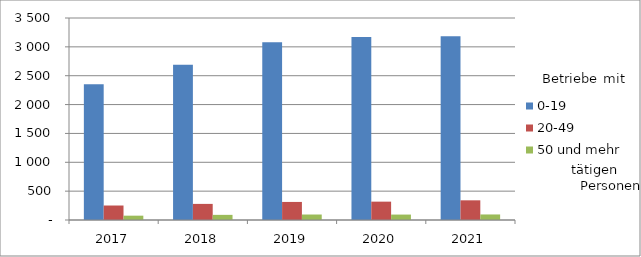
| Category | 0-19 | 20-49 | 50 und mehr |
|---|---|---|---|
| 2017.0 | 2350 | 251 | 75 |
| 2018.0 | 2691 | 279 | 89 |
| 2019.0 | 3080 | 313 | 95 |
| 2020.0 | 3171 | 318 | 94 |
| 2021.0 | 3185 | 341 | 96 |